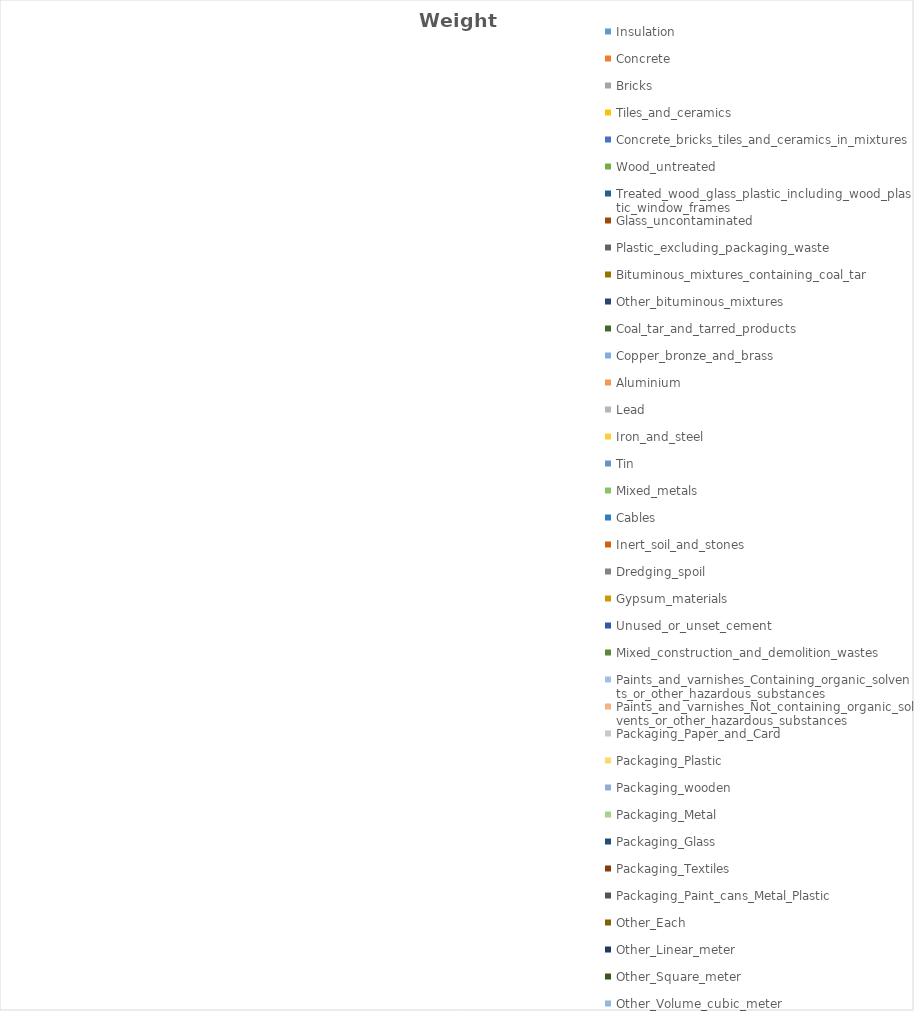
| Category | Weight (t) |
|---|---|
| Insulation | 0 |
| Concrete | 0 |
| Bricks | 0 |
| Tiles_and_ceramics | 0 |
| Concrete_bricks_tiles_and_ceramics_in_mixtures | 0 |
| Wood_untreated | 0 |
| Treated_wood_glass_plastic_including_wood_plastic_window_frames | 0 |
| Glass_uncontaminated | 0 |
| Plastic_excluding_packaging_waste | 0 |
| Bituminous_mixtures_containing_coal_tar | 0 |
| Other_bituminous_mixtures | 0 |
| Coal_tar_and_tarred_products | 0 |
| Copper_bronze_and_brass | 0 |
| Aluminium | 0 |
| Lead | 0 |
| Iron_and_steel | 0 |
| Tin | 0 |
| Mixed_metals | 0 |
| Cables | 0 |
| Inert_soil_and_stones | 0 |
| Dredging_spoil | 0 |
| Gypsum_materials | 0 |
| Unused_or_unset_cement | 0 |
| Mixed_construction_and_demolition_wastes | 0 |
| Paints_and_varnishes_Containing_organic_solvents_or_other_hazardous_substances | 0 |
| Paints_and_varnishes_Not_containing_organic_solvents_or_other_hazardous_substances | 0 |
| Packaging_Paper_and_Card | 0 |
| Packaging_Plastic | 0 |
| Packaging_wooden | 0 |
| Packaging_Metal | 0 |
| Packaging_Glass | 0 |
| Packaging_Textiles | 0 |
| Packaging_Paint_cans_Metal_Plastic | 0 |
| Other_Each | 0 |
| Other_Linear_meter | 0 |
| Other_Square_meter | 0 |
| Other_Volume_cubic_meter | 0 |